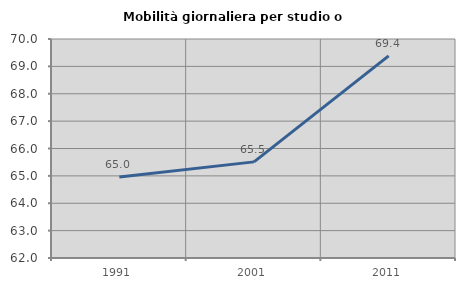
| Category | Mobilità giornaliera per studio o lavoro |
|---|---|
| 1991.0 | 64.962 |
| 2001.0 | 65.512 |
| 2011.0 | 69.385 |